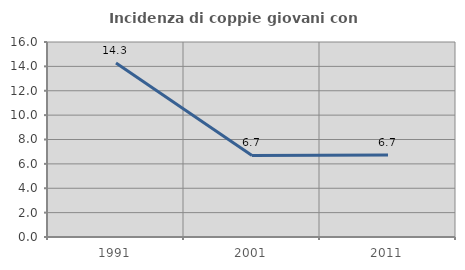
| Category | Incidenza di coppie giovani con figli |
|---|---|
| 1991.0 | 14.286 |
| 2001.0 | 6.693 |
| 2011.0 | 6.719 |